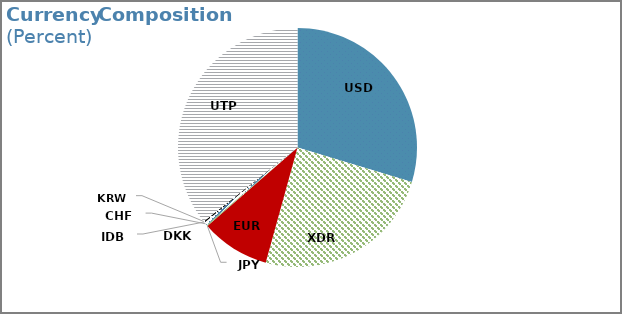
| Category | Share (Percent) |
|---|---|
| USD | 29.668 |
| XDR | 24.622 |
| EUR | 9.311 |
| JPY | 0.006 |
| DKK | 0.161 |
| CHF | 0.419 |
| IDB | 0.2 |
| KRW | 0 |
| UTP | 35.613 |